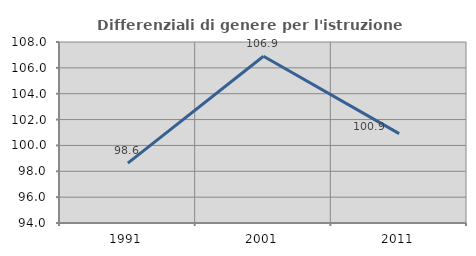
| Category | Differenziali di genere per l'istruzione superiore |
|---|---|
| 1991.0 | 98.632 |
| 2001.0 | 106.902 |
| 2011.0 | 100.912 |